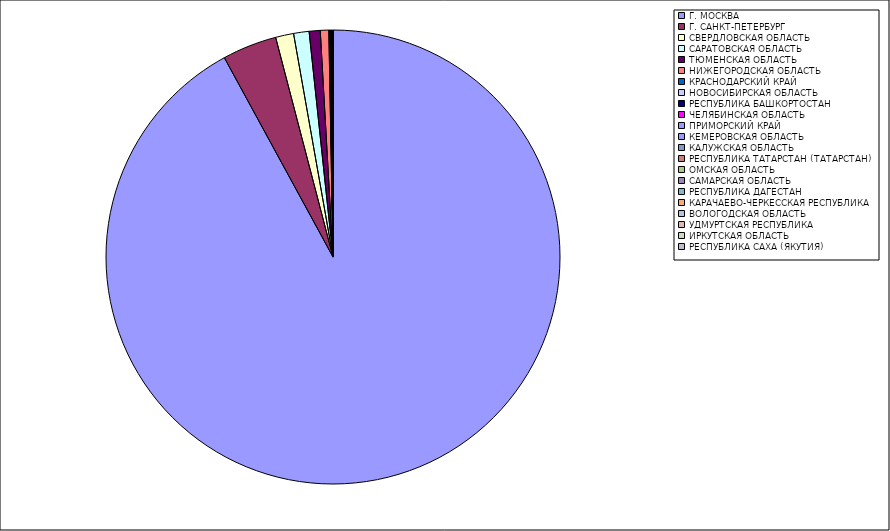
| Category | Оборот |
|---|---|
| Г. МОСКВА | 91.999 |
| Г. САНКТ-ПЕТЕРБУРГ | 3.876 |
| СВЕРДЛОВСКАЯ ОБЛАСТЬ | 1.284 |
| САРАТОВСКАЯ ОБЛАСТЬ | 1.098 |
| ТЮМЕНСКАЯ ОБЛАСТЬ | 0.787 |
| НИЖЕГОРОДСКАЯ ОБЛАСТЬ | 0.602 |
| КРАСНОДАРСКИЙ КРАЙ | 0.052 |
| НОВОСИБИРСКАЯ ОБЛАСТЬ | 0.04 |
| РЕСПУБЛИКА БАШКОРТОСТАН | 0.031 |
| ЧЕЛЯБИНСКАЯ ОБЛАСТЬ | 0.031 |
| ПРИМОРСКИЙ КРАЙ | 0.023 |
| КЕМЕРОВСКАЯ ОБЛАСТЬ | 0.017 |
| КАЛУЖСКАЯ ОБЛАСТЬ | 0.016 |
| РЕСПУБЛИКА ТАТАРСТАН (ТАТАРСТАН) | 0.014 |
| ОМСКАЯ ОБЛАСТЬ | 0.013 |
| САМАРСКАЯ ОБЛАСТЬ | 0.013 |
| РЕСПУБЛИКА ДАГЕСТАН | 0.01 |
| КАРАЧАЕВО-ЧЕРКЕССКАЯ РЕСПУБЛИКА | 0.008 |
| ВОЛОГОДСКАЯ ОБЛАСТЬ | 0.008 |
| УДМУРТСКАЯ РЕСПУБЛИКА | 0.006 |
| ИРКУТСКАЯ ОБЛАСТЬ | 0.006 |
| РЕСПУБЛИКА САХА (ЯКУТИЯ) | 0.005 |